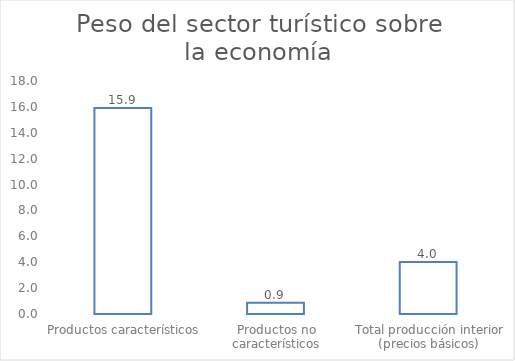
| Category | Series 0 |
|---|---|
| Productos característicos | 15.905 |
| Productos no característicos | 0.86 |
| Total producción interior (precios básicos) | 4.014 |